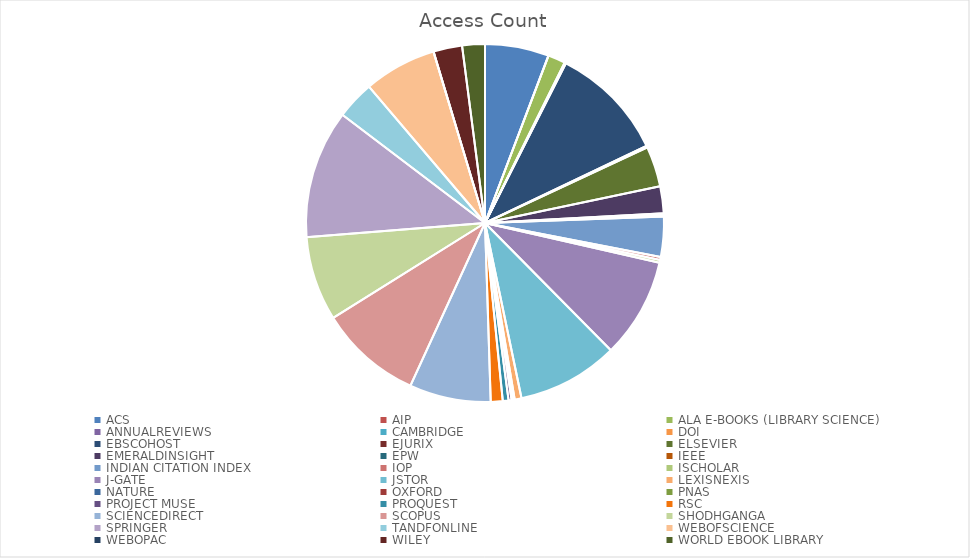
| Category | Access Count |
|---|---|
| ACS | 1135 |
| AIP | 3 |
| ALA E-BOOKS (LIBRARY SCIENCE) | 307 |
| ANNUALREVIEWS | 12 |
| CAMBRIDGE | 3 |
| DOI | 10 |
| EBSCOHOST | 2056 |
| EJURIX | 31 |
| ELSEVIER | 718 |
| EMERALDINSIGHT | 477 |
| EPW | 24 |
| IEEE | 36 |
| INDIAN CITATION INDEX | 712 |
| IOP | 53 |
| ISCHOLAR | 49 |
| J-GATE | 1777 |
| JSTOR | 1800 |
| LEXISNEXIS | 122 |
| NATURE | 31 |
| OXFORD | 12 |
| PNAS | 12 |
| PROJECT MUSE | 53 |
| PROQUEST | 102 |
| RSC | 212 |
| SCIENCEDIRECT | 1448 |
| SCOPUS | 1824 |
| SHODHGANGA | 1502 |
| SPRINGER | 2285 |
| TANDFONLINE | 678 |
| WEBOFSCIENCE | 1295 |
| WEBOPAC | 2 |
| WILEY | 510 |
| WORLD EBOOK LIBRARY | 404 |